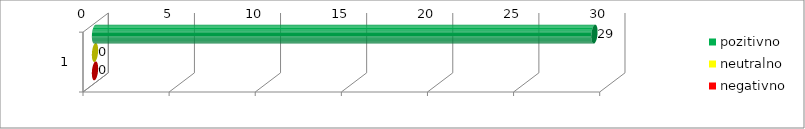
| Category | pozitivno | neutralno | negativno |
|---|---|---|---|
| 0 | 29 | 0 | 0 |